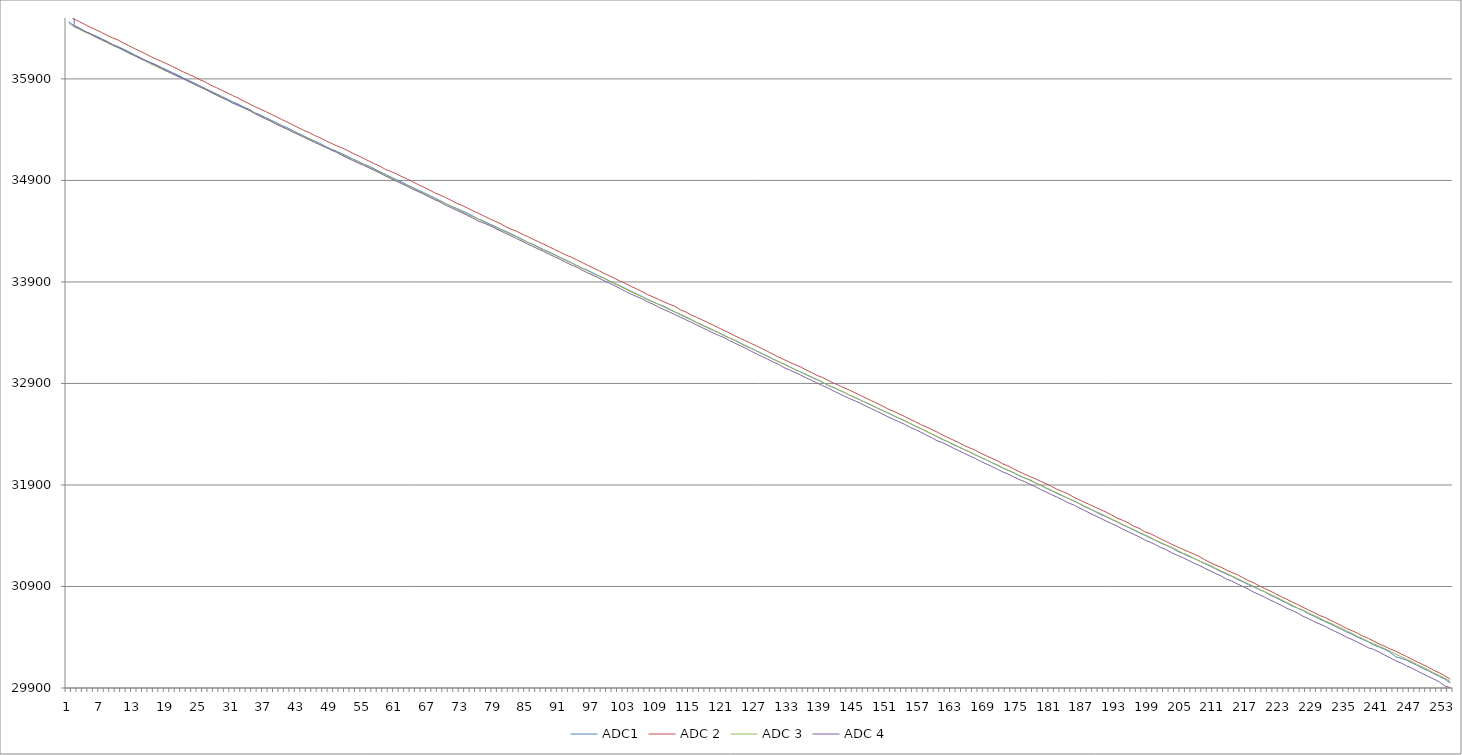
| Category | ADC1 | ADC 2 | ADC 3 | ADC 4 |
|---|---|---|---|---|
| 0 | 36462 | 36525 | 36449 | 49152 |
| 1 | 36424 | 36489 | 36412 | 36419 |
| 2 | 36400 | 36463 | 36386 | 36396 |
| 3 | 36368 | 36435 | 36360 | 36367 |
| 4 | 36345 | 36408 | 36337 | 36344 |
| 5 | 36322 | 36384 | 36309 | 36312 |
| 6 | 36296 | 36358 | 36282 | 36290 |
| 7 | 36270 | 36330 | 36258 | 36264 |
| 8 | 36240 | 36305 | 36230 | 36236 |
| 9 | 36218 | 36284 | 36208 | 36212 |
| 10 | 36194 | 36254 | 36181 | 36186 |
| 11 | 36168 | 36228 | 36152 | 36157 |
| 12 | 36138 | 36200 | 36128 | 36134 |
| 13 | 36113 | 36175 | 36101 | 36105 |
| 14 | 36084 | 36149 | 36076 | 36083 |
| 15 | 36062 | 36120 | 36048 | 36056 |
| 16 | 36039 | 36095 | 36023 | 36033 |
| 17 | 36012 | 36072 | 35998 | 36004 |
| 18 | 35988 | 36048 | 35973 | 35976 |
| 19 | 35962 | 36022 | 35949 | 35952 |
| 20 | 35937 | 35996 | 35923 | 35926 |
| 21 | 35909 | 35968 | 35899 | 35902 |
| 22 | 35884 | 35944 | 35872 | 35876 |
| 23 | 35859 | 35921 | 35848 | 35848 |
| 24 | 35832 | 35892 | 35821 | 35823 |
| 25 | 35806 | 35870 | 35797 | 35797 |
| 26 | 35779 | 35838 | 35770 | 35770 |
| 27 | 35754 | 35815 | 35740 | 35744 |
| 28 | 35728 | 35788 | 35716 | 35716 |
| 29 | 35702 | 35764 | 35693 | 35692 |
| 30 | 35675 | 35736 | 35666 | 35662 |
| 31 | 35651 | 35712 | 35639 | 35641 |
| 32 | 35625 | 35683 | 35614 | 35616 |
| 33 | 35602 | 35657 | 35592 | 35592 |
| 34 | 35568 | 35628 | 35565 | 35560 |
| 35 | 35548 | 35606 | 35537 | 35534 |
| 36 | 35520 | 35580 | 35511 | 35508 |
| 37 | 35495 | 35554 | 35485 | 35483 |
| 38 | 35469 | 35528 | 35458 | 35454 |
| 39 | 35442 | 35500 | 35434 | 35429 |
| 40 | 35420 | 35475 | 35408 | 35404 |
| 41 | 35392 | 35448 | 35383 | 35376 |
| 42 | 35364 | 35421 | 35359 | 35353 |
| 43 | 35340 | 35394 | 35332 | 35326 |
| 44 | 35312 | 35372 | 35308 | 35302 |
| 45 | 35289 | 35343 | 35282 | 35274 |
| 46 | 35264 | 35321 | 35255 | 35252 |
| 47 | 35236 | 35292 | 35229 | 35228 |
| 48 | 35210 | 35268 | 35204 | 35201 |
| 49 | 35188 | 35242 | 35181 | 35178 |
| 50 | 35164 | 35222 | 35154 | 35149 |
| 51 | 35139 | 35196 | 35128 | 35122 |
| 52 | 35112 | 35168 | 35106 | 35096 |
| 53 | 35088 | 35143 | 35081 | 35071 |
| 54 | 35062 | 35117 | 35060 | 35048 |
| 55 | 35040 | 35090 | 35030 | 35023 |
| 56 | 35013 | 35064 | 35002 | 34998 |
| 57 | 34986 | 35040 | 34978 | 34972 |
| 58 | 34960 | 35008 | 34956 | 34944 |
| 59 | 34933 | 34988 | 34924 | 34918 |
| 60 | 34908 | 34964 | 34900 | 34892 |
| 61 | 34884 | 34938 | 34872 | 34868 |
| 62 | 34856 | 34913 | 34851 | 34841 |
| 63 | 34830 | 34886 | 34824 | 34814 |
| 64 | 34805 | 34859 | 34797 | 34790 |
| 65 | 34780 | 34834 | 34772 | 34764 |
| 66 | 34754 | 34808 | 34748 | 34737 |
| 67 | 34728 | 34778 | 34718 | 34710 |
| 68 | 34701 | 34756 | 34696 | 34688 |
| 69 | 34674 | 34732 | 34671 | 34656 |
| 70 | 34648 | 34705 | 34646 | 34632 |
| 71 | 34625 | 34676 | 34617 | 34606 |
| 72 | 34601 | 34654 | 34593 | 34581 |
| 73 | 34577 | 34628 | 34564 | 34556 |
| 74 | 34549 | 34601 | 34543 | 34529 |
| 75 | 34520 | 34577 | 34518 | 34500 |
| 76 | 34500 | 34551 | 34492 | 34480 |
| 77 | 34472 | 34524 | 34465 | 34458 |
| 78 | 34449 | 34500 | 34440 | 34430 |
| 79 | 34422 | 34476 | 34416 | 34404 |
| 80 | 34400 | 34445 | 34392 | 34379 |
| 81 | 34374 | 34420 | 34368 | 34354 |
| 82 | 34348 | 34399 | 34344 | 34327 |
| 83 | 34321 | 34372 | 34314 | 34301 |
| 84 | 34292 | 34348 | 34291 | 34274 |
| 85 | 34271 | 34322 | 34266 | 34249 |
| 86 | 34245 | 34296 | 34238 | 34224 |
| 87 | 34218 | 34272 | 34212 | 34199 |
| 88 | 34195 | 34245 | 34189 | 34172 |
| 89 | 34168 | 34220 | 34164 | 34148 |
| 90 | 34141 | 34193 | 34138 | 34122 |
| 91 | 34116 | 34167 | 34112 | 34094 |
| 92 | 34092 | 34144 | 34088 | 34068 |
| 93 | 34063 | 34119 | 34061 | 34046 |
| 94 | 34036 | 34092 | 34036 | 34016 |
| 95 | 34016 | 34065 | 34010 | 33990 |
| 96 | 33988 | 34039 | 33982 | 33966 |
| 97 | 33962 | 34014 | 33958 | 33940 |
| 98 | 33938 | 33985 | 33935 | 33913 |
| 99 | 33911 | 33961 | 33908 | 33888 |
| 100 | 33885 | 33935 | 33881 | 33862 |
| 101 | 33860 | 33907 | 33855 | 33834 |
| 102 | 33834 | 33883 | 33829 | 33806 |
| 103 | 33808 | 33856 | 33803 | 33780 |
| 104 | 33782 | 33831 | 33776 | 33756 |
| 105 | 33756 | 33805 | 33753 | 33733 |
| 106 | 33728 | 33775 | 33724 | 33704 |
| 107 | 33704 | 33753 | 33703 | 33681 |
| 108 | 33680 | 33728 | 33678 | 33652 |
| 109 | 33660 | 33704 | 33653 | 33628 |
| 110 | 33632 | 33680 | 33626 | 33604 |
| 111 | 33604 | 33660 | 33603 | 33578 |
| 112 | 33580 | 33626 | 33576 | 33554 |
| 113 | 33556 | 33604 | 33549 | 33528 |
| 114 | 33529 | 33574 | 33525 | 33502 |
| 115 | 33502 | 33551 | 33498 | 33476 |
| 116 | 33476 | 33526 | 33472 | 33450 |
| 117 | 33452 | 33500 | 33447 | 33424 |
| 118 | 33426 | 33475 | 33423 | 33398 |
| 119 | 33401 | 33449 | 33400 | 33374 |
| 120 | 33374 | 33422 | 33370 | 33352 |
| 121 | 33348 | 33397 | 33347 | 33322 |
| 122 | 33326 | 33369 | 33324 | 33297 |
| 123 | 33297 | 33344 | 33293 | 33271 |
| 124 | 33272 | 33319 | 33266 | 33246 |
| 125 | 33245 | 33294 | 33244 | 33217 |
| 126 | 33220 | 33268 | 33218 | 33191 |
| 127 | 33194 | 33242 | 33190 | 33164 |
| 128 | 33168 | 33215 | 33165 | 33139 |
| 129 | 33140 | 33187 | 33138 | 33112 |
| 130 | 33114 | 33159 | 33115 | 33088 |
| 131 | 33091 | 33135 | 33090 | 33056 |
| 132 | 33064 | 33110 | 33063 | 33033 |
| 133 | 33038 | 33085 | 33036 | 33009 |
| 134 | 33014 | 33064 | 33014 | 32984 |
| 135 | 32990 | 33034 | 32986 | 32956 |
| 136 | 32964 | 33009 | 32960 | 32932 |
| 137 | 32940 | 32980 | 32936 | 32906 |
| 138 | 32913 | 32960 | 32913 | 32880 |
| 139 | 32882 | 32932 | 32884 | 32856 |
| 140 | 32862 | 32905 | 32860 | 32828 |
| 141 | 32838 | 32882 | 32836 | 32802 |
| 142 | 32812 | 32856 | 32812 | 32776 |
| 143 | 32785 | 32835 | 32787 | 32751 |
| 144 | 32761 | 32808 | 32761 | 32728 |
| 145 | 32736 | 32781 | 32736 | 32704 |
| 146 | 32711 | 32756 | 32711 | 32677 |
| 147 | 32687 | 32730 | 32684 | 32651 |
| 148 | 32659 | 32705 | 32660 | 32626 |
| 149 | 32635 | 32678 | 32632 | 32600 |
| 150 | 32610 | 32650 | 32610 | 32572 |
| 151 | 32583 | 32627 | 32584 | 32548 |
| 152 | 32558 | 32602 | 32558 | 32524 |
| 153 | 32536 | 32576 | 32533 | 32499 |
| 154 | 32508 | 32550 | 32509 | 32471 |
| 155 | 32479 | 32524 | 32480 | 32446 |
| 156 | 32456 | 32495 | 32457 | 32422 |
| 157 | 32430 | 32473 | 32430 | 32392 |
| 158 | 32402 | 32448 | 32404 | 32367 |
| 159 | 32377 | 32422 | 32377 | 32336 |
| 160 | 32348 | 32392 | 32352 | 32318 |
| 161 | 32326 | 32368 | 32326 | 32292 |
| 162 | 32296 | 32342 | 32302 | 32262 |
| 163 | 32274 | 32317 | 32275 | 32237 |
| 164 | 32248 | 32290 | 32247 | 32212 |
| 165 | 32226 | 32265 | 32226 | 32186 |
| 166 | 32196 | 32242 | 32198 | 32162 |
| 167 | 32172 | 32214 | 32172 | 32132 |
| 168 | 32148 | 32188 | 32148 | 32108 |
| 169 | 32122 | 32164 | 32121 | 32084 |
| 170 | 32095 | 32140 | 32098 | 32057 |
| 171 | 32068 | 32109 | 32072 | 32030 |
| 172 | 32045 | 32088 | 32045 | 32008 |
| 173 | 32020 | 32060 | 32024 | 31981 |
| 174 | 31993 | 32032 | 31997 | 31956 |
| 175 | 31968 | 32008 | 31972 | 31934 |
| 176 | 31952 | 31984 | 31944 | 31908 |
| 177 | 31922 | 31961 | 31920 | 31883 |
| 178 | 31895 | 31936 | 31896 | 31855 |
| 179 | 31868 | 31912 | 31872 | 31830 |
| 180 | 31844 | 31886 | 31847 | 31804 |
| 181 | 31816 | 31856 | 31822 | 31780 |
| 182 | 31792 | 31835 | 31796 | 31754 |
| 183 | 31769 | 31812 | 31768 | 31725 |
| 184 | 31743 | 31781 | 31746 | 31704 |
| 185 | 31718 | 31755 | 31720 | 31676 |
| 186 | 31686 | 31730 | 31693 | 31650 |
| 187 | 31664 | 31706 | 31667 | 31622 |
| 188 | 31638 | 31680 | 31640 | 31596 |
| 189 | 31608 | 31657 | 31618 | 31570 |
| 190 | 31588 | 31632 | 31590 | 31544 |
| 191 | 31560 | 31604 | 31565 | 31519 |
| 192 | 31535 | 31573 | 31538 | 31494 |
| 193 | 31508 | 31552 | 31512 | 31466 |
| 194 | 31483 | 31528 | 31486 | 31441 |
| 195 | 31458 | 31495 | 31462 | 31414 |
| 196 | 31430 | 31474 | 31436 | 31390 |
| 197 | 31406 | 31440 | 31411 | 31360 |
| 198 | 31380 | 31422 | 31386 | 31337 |
| 199 | 31354 | 31395 | 31358 | 31313 |
| 200 | 31328 | 31368 | 31333 | 31283 |
| 201 | 31305 | 31343 | 31308 | 31262 |
| 202 | 31281 | 31315 | 31285 | 31232 |
| 203 | 31248 | 31290 | 31260 | 31208 |
| 204 | 31226 | 31267 | 31229 | 31185 |
| 205 | 31200 | 31244 | 31208 | 31158 |
| 206 | 31178 | 31220 | 31180 | 31132 |
| 207 | 31152 | 31196 | 31152 | 31108 |
| 208 | 31127 | 31165 | 31131 | 31081 |
| 209 | 31102 | 31136 | 31108 | 31055 |
| 210 | 31074 | 31112 | 31079 | 31028 |
| 211 | 31047 | 31090 | 31054 | 31005 |
| 212 | 31023 | 31062 | 31032 | 30972 |
| 213 | 31000 | 31038 | 31004 | 30954 |
| 214 | 30972 | 31016 | 30980 | 30925 |
| 215 | 30946 | 30988 | 30952 | 30901 |
| 216 | 30920 | 30958 | 30927 | 30874 |
| 217 | 30896 | 30936 | 30902 | 30844 |
| 218 | 30870 | 30907 | 30872 | 30820 |
| 219 | 30848 | 30880 | 30849 | 30795 |
| 220 | 30815 | 30856 | 30824 | 30767 |
| 221 | 30792 | 30828 | 30800 | 30742 |
| 222 | 30764 | 30800 | 30772 | 30716 |
| 223 | 30738 | 30777 | 30744 | 30687 |
| 224 | 30708 | 30748 | 30718 | 30665 |
| 225 | 30688 | 30723 | 30688 | 30639 |
| 226 | 30664 | 30696 | 30669 | 30608 |
| 227 | 30633 | 30670 | 30642 | 30584 |
| 228 | 30609 | 30644 | 30616 | 30556 |
| 229 | 30581 | 30616 | 30592 | 30532 |
| 230 | 30556 | 30596 | 30564 | 30510 |
| 231 | 30533 | 30569 | 30542 | 30481 |
| 232 | 30505 | 30543 | 30516 | 30455 |
| 233 | 30481 | 30516 | 30490 | 30430 |
| 234 | 30452 | 30487 | 30465 | 30400 |
| 235 | 30430 | 30465 | 30438 | 30378 |
| 236 | 30401 | 30440 | 30410 | 30352 |
| 237 | 30378 | 30411 | 30386 | 30325 |
| 238 | 30354 | 30389 | 30358 | 30296 |
| 239 | 30324 | 30361 | 30336 | 30280 |
| 240 | 30303 | 30333 | 30312 | 30253 |
| 241 | 30280 | 30311 | 30288 | 30224 |
| 242 | 30252 | 30284 | 30262 | 30197 |
| 243 | 30208 | 30263 | 30234 | 30168 |
| 244 | 30192 | 30236 | 30209 | 30146 |
| 245 | 30174 | 30210 | 30183 | 30118 |
| 246 | 30148 | 30182 | 30160 | 30094 |
| 247 | 30120 | 30156 | 30130 | 30066 |
| 248 | 30093 | 30130 | 30105 | 30040 |
| 249 | 30070 | 30104 | 30078 | 30012 |
| 250 | 30040 | 30074 | 30048 | 29988 |
| 251 | 30014 | 30049 | 30025 | 29960 |
| 252 | 29988 | 30020 | 29997 | 29920 |
| 253 | 29949 | 29986 | 29964 | 29904 |